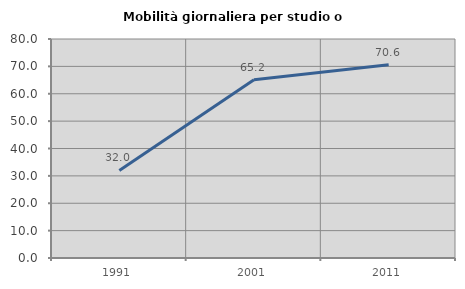
| Category | Mobilità giornaliera per studio o lavoro |
|---|---|
| 1991.0 | 31.992 |
| 2001.0 | 65.154 |
| 2011.0 | 70.635 |